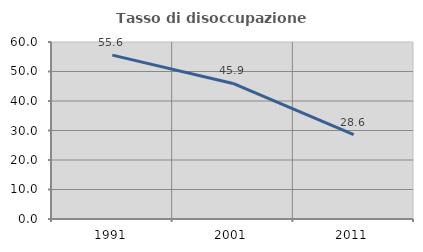
| Category | Tasso di disoccupazione giovanile  |
|---|---|
| 1991.0 | 55.556 |
| 2001.0 | 45.946 |
| 2011.0 | 28.571 |